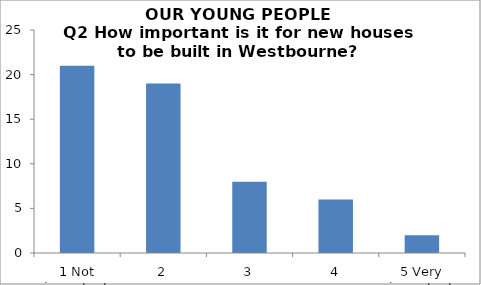
| Category | Series 0 |
|---|---|
| 1 Not important | 21 |
| 2 | 19 |
| 3 | 8 |
| 4 | 6 |
| 5 Very important | 2 |